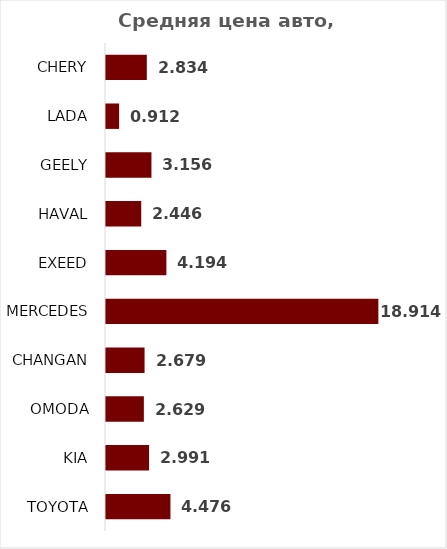
| Category | Ср.Цена, млн.руб. |
|---|---|
| CHERY | 2.834 |
| LADA | 0.912 |
| GEELY | 3.156 |
| HAVAL | 2.446 |
| EXEED | 4.194 |
| MERCEDES | 18.914 |
| CHANGAN | 2.679 |
| OMODA | 2.629 |
| KIA | 2.991 |
| TOYOTA | 4.476 |